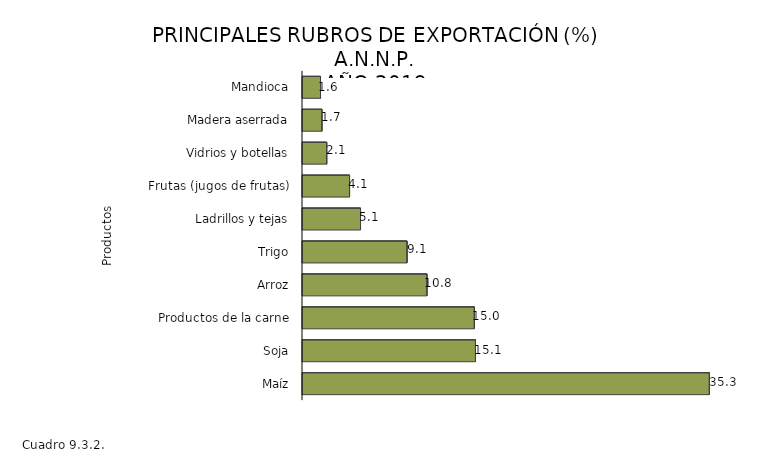
| Category | Series 0 |
|---|---|
| Maíz | 35.346 |
| Soja | 15.053 |
| Productos de la carne | 14.955 |
| Arroz | 10.842 |
| Trigo | 9.115 |
| Ladrillos y tejas | 5.078 |
| Frutas (jugos de frutas) | 4.127 |
| Vidrios y botellas | 2.145 |
| Madera aserrada | 1.732 |
| Mandioca | 1.607 |